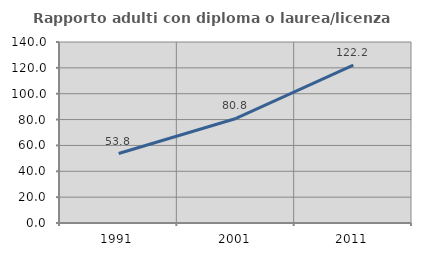
| Category | Rapporto adulti con diploma o laurea/licenza media  |
|---|---|
| 1991.0 | 53.753 |
| 2001.0 | 80.838 |
| 2011.0 | 122.153 |